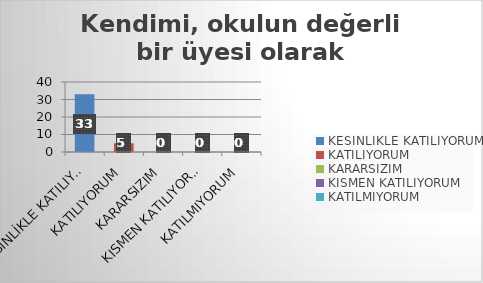
| Category | Kendimi, okulun değerli bir üyesi olarak görürüm. |
|---|---|
| KESİNLİKLE KATILIYORUM | 33 |
| KATILIYORUM | 5 |
| KARARSIZIM | 0 |
| KISMEN KATILIYORUM | 0 |
| KATILMIYORUM | 0 |